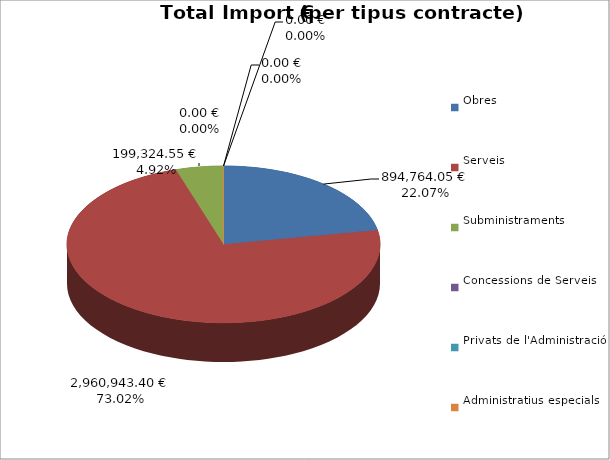
| Category | Total preu
(amb IVA) |
|---|---|
| Obres | 894764.05 |
| Serveis | 2960943.4 |
| Subministraments | 199324.55 |
| Concessions de Serveis | 0 |
| Privats de l'Administració | 0 |
| Administratius especials | 0 |